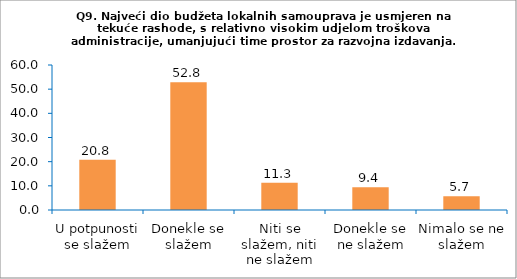
| Category | Series 0 |
|---|---|
| U potpunosti se slažem | 20.755 |
| Donekle se slažem | 52.83 |
| Niti se slažem, niti ne slažem | 11.321 |
| Donekle se ne slažem | 9.434 |
| Nimalo se ne slažem | 5.66 |